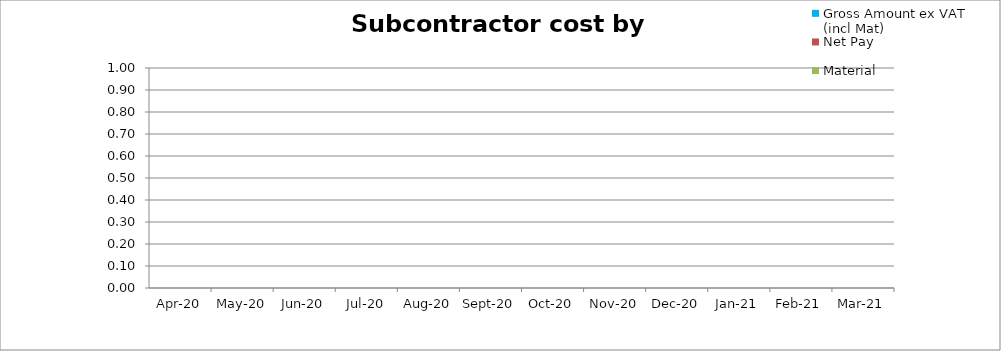
| Category | Gross Amount ex VAT (incl Mat) | Net Pay | Material |
|---|---|---|---|
| 2020-04-01 | 0 | 0 | 0 |
| 2020-05-02 | 0 | 0 | 0 |
| 2020-06-02 | 0 | 0 | 0 |
| 2020-07-03 | 0 | 0 | 0 |
| 2020-08-03 | 0 | 0 | 0 |
| 2020-09-03 | 0 | 0 | 0 |
| 2020-10-04 | 0 | 0 | 0 |
| 2020-11-04 | 0 | 0 | 0 |
| 2020-12-05 | 0 | 0 | 0 |
| 2021-01-05 | 0 | 0 | 0 |
| 2021-02-05 | 0 | 0 | 0 |
| 2021-03-08 | 0 | 0 | 0 |